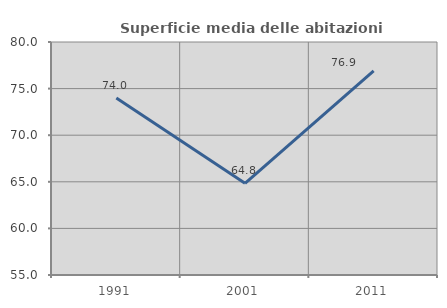
| Category | Superficie media delle abitazioni occupate |
|---|---|
| 1991.0 | 73.981 |
| 2001.0 | 64.835 |
| 2011.0 | 76.904 |